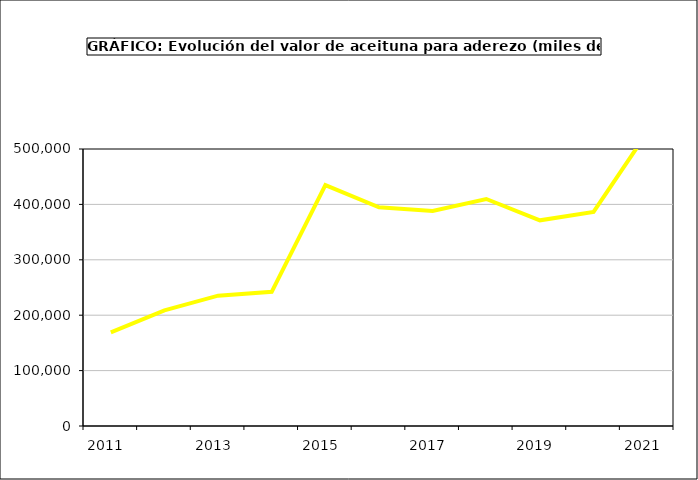
| Category | producción |
|---|---|
| 2011.0 | 168933.753 |
| 2012.0 | 208668.687 |
| 2013.0 | 235213.576 |
| 2014.0 | 242272.525 |
| 2015.0 | 434946 |
| 2016.0 | 394686 |
| 2017.0 | 388313.865 |
| 2018.0 | 409725.361 |
| 2019.0 | 371208.518 |
| 2020.0 | 386355.608 |
| 2021.0 | 529810.238 |